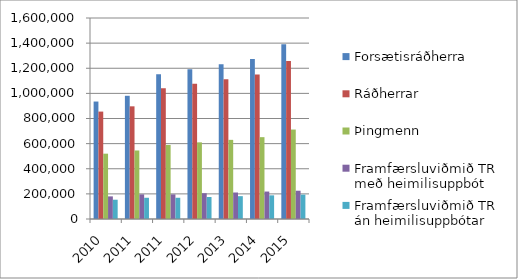
| Category | Forsætisráðherra | Ráðherrar | Þingmenn | Framfærsluviðmið TR með heimilisuppbót | Framfærsluviðmið TR án heimilisuppbótar |
|---|---|---|---|---|---|
| 2010.0 | 935000 | 855000 | 520000 | 180000 | 153500 |
| 2011.0 | 980815 | 896895 | 545480 | 196140 | 169030 |
| 2011.0 | 1152020 | 1041144 | 589559 | 196140 | 169030 |
| 2012.0 | 1192341 | 1077584 | 610193 | 205005 | 174946 |
| 2013.0 | 1231092 | 1112606 | 630024 | 210922 | 181769 |
| 2014.0 | 1272949 | 1150434 | 651445 | 218515 | 188313 |
| 2015.0 | 1391333 | 1257425 | 712030 | 225070 | 193962 |